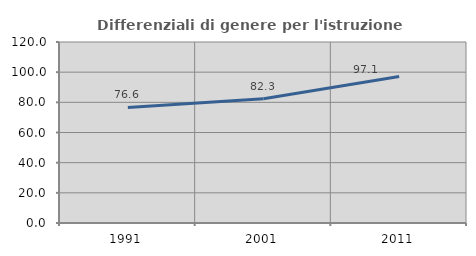
| Category | Differenziali di genere per l'istruzione superiore |
|---|---|
| 1991.0 | 76.631 |
| 2001.0 | 82.333 |
| 2011.0 | 97.144 |